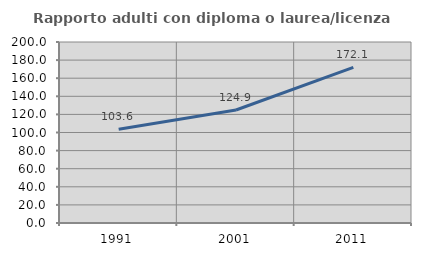
| Category | Rapporto adulti con diploma o laurea/licenza media  |
|---|---|
| 1991.0 | 103.621 |
| 2001.0 | 124.859 |
| 2011.0 | 172.051 |